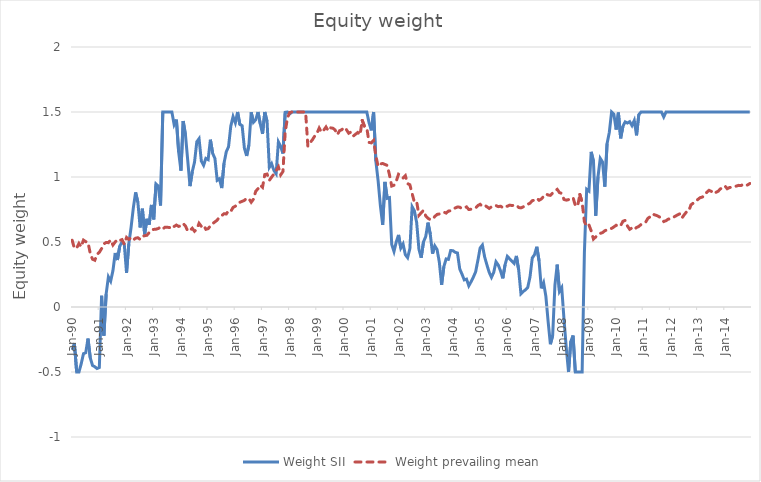
| Category | Weight SII | Weight prevailing mean |
|---|---|---|
| 1990-01-01 | -0.33 | 0.514 |
| 1990-02-01 | -0.278 | 0.451 |
| 1990-03-01 | -0.5 | 0.454 |
| 1990-04-01 | -0.5 | 0.489 |
| 1990-05-01 | -0.437 | 0.463 |
| 1990-06-01 | -0.359 | 0.515 |
| 1990-07-01 | -0.352 | 0.503 |
| 1990-08-01 | -0.243 | 0.498 |
| 1990-09-01 | -0.392 | 0.411 |
| 1990-10-01 | -0.45 | 0.368 |
| 1990-11-01 | -0.459 | 0.36 |
| 1990-12-01 | -0.473 | 0.405 |
| 1991-01-01 | -0.466 | 0.421 |
| 1991-02-01 | 0.087 | 0.449 |
| 1991-03-01 | -0.221 | 0.485 |
| 1991-04-01 | 0.099 | 0.496 |
| 1991-05-01 | 0.232 | 0.495 |
| 1991-06-01 | 0.199 | 0.516 |
| 1991-07-01 | 0.28 | 0.477 |
| 1991-08-01 | 0.415 | 0.5 |
| 1991-09-01 | 0.362 | 0.521 |
| 1991-10-01 | 0.468 | 0.512 |
| 1991-11-01 | 0.5 | 0.518 |
| 1991-12-01 | 0.484 | 0.483 |
| 1992-01-01 | 0.262 | 0.535 |
| 1992-02-01 | 0.486 | 0.52 |
| 1992-03-01 | 0.612 | 0.533 |
| 1992-04-01 | 0.762 | 0.515 |
| 1992-05-01 | 0.882 | 0.529 |
| 1992-06-01 | 0.807 | 0.533 |
| 1992-07-01 | 0.612 | 0.52 |
| 1992-08-01 | 0.756 | 0.543 |
| 1992-09-01 | 0.559 | 0.548 |
| 1992-10-01 | 0.678 | 0.552 |
| 1992-11-01 | 0.633 | 0.573 |
| 1992-12-01 | 0.785 | 0.592 |
| 1993-01-01 | 0.674 | 0.597 |
| 1993-02-01 | 0.946 | 0.599 |
| 1993-03-01 | 0.93 | 0.604 |
| 1993-04-01 | 0.781 | 0.614 |
| 1993-05-01 | 1.5 | 0.601 |
| 1993-06-01 | 1.5 | 0.614 |
| 1993-07-01 | 1.5 | 0.614 |
| 1993-08-01 | 1.5 | 0.611 |
| 1993-09-01 | 1.5 | 0.63 |
| 1993-10-01 | 1.404 | 0.62 |
| 1993-11-01 | 1.442 | 0.63 |
| 1993-12-01 | 1.192 | 0.62 |
| 1994-01-01 | 1.049 | 0.625 |
| 1994-02-01 | 1.43 | 0.642 |
| 1994-03-01 | 1.324 | 0.623 |
| 1994-04-01 | 1.128 | 0.584 |
| 1994-05-01 | 0.93 | 0.588 |
| 1994-06-01 | 1.041 | 0.606 |
| 1994-07-01 | 1.115 | 0.582 |
| 1994-08-01 | 1.271 | 0.6 |
| 1994-09-01 | 1.295 | 0.644 |
| 1994-10-01 | 1.123 | 0.621 |
| 1994-11-01 | 1.09 | 0.631 |
| 1994-12-01 | 1.143 | 0.598 |
| 1995-01-01 | 1.134 | 0.603 |
| 1995-02-01 | 1.287 | 0.624 |
| 1995-03-01 | 1.182 | 0.642 |
| 1995-04-01 | 1.142 | 0.655 |
| 1995-05-01 | 0.975 | 0.668 |
| 1995-06-01 | 0.987 | 0.693 |
| 1995-07-01 | 0.915 | 0.702 |
| 1995-08-01 | 1.104 | 0.718 |
| 1995-09-01 | 1.194 | 0.715 |
| 1995-10-01 | 1.232 | 0.741 |
| 1995-11-01 | 1.392 | 0.736 |
| 1995-12-01 | 1.465 | 0.766 |
| 1996-01-01 | 1.417 | 0.775 |
| 1996-02-01 | 1.5 | 0.791 |
| 1996-03-01 | 1.404 | 0.806 |
| 1996-04-01 | 1.395 | 0.813 |
| 1996-05-01 | 1.221 | 0.82 |
| 1996-06-01 | 1.162 | 0.837 |
| 1996-07-01 | 1.247 | 0.834 |
| 1996-08-01 | 1.498 | 0.806 |
| 1996-09-01 | 1.421 | 0.829 |
| 1996-10-01 | 1.44 | 0.89 |
| 1996-11-01 | 1.5 | 0.91 |
| 1996-12-01 | 1.41 | 0.938 |
| 1997-01-01 | 1.332 | 0.921 |
| 1997-02-01 | 1.5 | 1.019 |
| 1997-03-01 | 1.426 | 1.023 |
| 1997-04-01 | 1.075 | 0.973 |
| 1997-05-01 | 1.103 | 0.999 |
| 1997-06-01 | 1.051 | 1.022 |
| 1997-07-01 | 1.025 | 1.048 |
| 1997-08-01 | 1.27 | 1.078 |
| 1997-09-01 | 1.235 | 1.016 |
| 1997-10-01 | 1.181 | 1.042 |
| 1997-11-01 | 1.497 | 1.346 |
| 1997-12-01 | 1.5 | 1.455 |
| 1998-01-01 | 1.485 | 1.497 |
| 1998-02-01 | 1.5 | 1.5 |
| 1998-03-01 | 1.5 | 1.5 |
| 1998-04-01 | 1.5 | 1.5 |
| 1998-05-01 | 1.5 | 1.5 |
| 1998-06-01 | 1.5 | 1.5 |
| 1998-07-01 | 1.5 | 1.5 |
| 1998-08-01 | 1.5 | 1.5 |
| 1998-09-01 | 1.5 | 1.237 |
| 1998-10-01 | 1.5 | 1.265 |
| 1998-11-01 | 1.5 | 1.286 |
| 1998-12-01 | 1.5 | 1.315 |
| 1999-01-01 | 1.5 | 1.336 |
| 1999-02-01 | 1.5 | 1.376 |
| 1999-03-01 | 1.5 | 1.344 |
| 1999-04-01 | 1.5 | 1.36 |
| 1999-05-01 | 1.5 | 1.385 |
| 1999-06-01 | 1.5 | 1.355 |
| 1999-07-01 | 1.5 | 1.378 |
| 1999-08-01 | 1.5 | 1.376 |
| 1999-09-01 | 1.5 | 1.362 |
| 1999-10-01 | 1.5 | 1.325 |
| 1999-11-01 | 1.5 | 1.356 |
| 1999-12-01 | 1.5 | 1.364 |
| 2000-01-01 | 1.5 | 1.382 |
| 2000-02-01 | 1.5 | 1.364 |
| 2000-03-01 | 1.5 | 1.337 |
| 2000-04-01 | 1.5 | 1.346 |
| 2000-05-01 | 1.5 | 1.314 |
| 2000-06-01 | 1.5 | 1.328 |
| 2000-07-01 | 1.5 | 1.342 |
| 2000-08-01 | 1.5 | 1.324 |
| 2000-09-01 | 1.5 | 1.435 |
| 2000-10-01 | 1.5 | 1.388 |
| 2000-11-01 | 1.5 | 1.378 |
| 2000-12-01 | 1.417 | 1.266 |
| 2001-01-01 | 1.359 | 1.263 |
| 2001-02-01 | 1.5 | 1.281 |
| 2001-03-01 | 1.122 | 1.162 |
| 2001-04-01 | 0.97 | 1.082 |
| 2001-05-01 | 0.779 | 1.1 |
| 2001-06-01 | 0.632 | 1.104 |
| 2001-07-01 | 0.962 | 1.096 |
| 2001-08-01 | 0.836 | 1.09 |
| 2001-09-01 | 0.84 | 1.017 |
| 2001-10-01 | 0.481 | 0.93 |
| 2001-11-01 | 0.428 | 0.937 |
| 2001-12-01 | 0.5 | 0.968 |
| 2002-01-01 | 0.555 | 1.021 |
| 2002-02-01 | 0.453 | 1.011 |
| 2002-03-01 | 0.485 | 0.992 |
| 2002-04-01 | 0.402 | 1.01 |
| 2002-05-01 | 0.379 | 0.949 |
| 2002-06-01 | 0.449 | 0.94 |
| 2002-07-01 | 0.771 | 0.872 |
| 2002-08-01 | 0.74 | 0.806 |
| 2002-09-01 | 0.649 | 0.81 |
| 2002-10-01 | 0.444 | 0.705 |
| 2002-11-01 | 0.379 | 0.724 |
| 2002-12-01 | 0.501 | 0.743 |
| 2003-01-01 | 0.542 | 0.7 |
| 2003-02-01 | 0.649 | 0.682 |
| 2003-03-01 | 0.56 | 0.672 |
| 2003-04-01 | 0.41 | 0.675 |
| 2003-05-01 | 0.47 | 0.696 |
| 2003-06-01 | 0.442 | 0.712 |
| 2003-07-01 | 0.345 | 0.716 |
| 2003-08-01 | 0.171 | 0.721 |
| 2003-09-01 | 0.311 | 0.73 |
| 2003-10-01 | 0.37 | 0.722 |
| 2003-11-01 | 0.366 | 0.738 |
| 2003-12-01 | 0.434 | 0.74 |
| 2004-01-01 | 0.433 | 0.754 |
| 2004-02-01 | 0.421 | 0.762 |
| 2004-03-01 | 0.415 | 0.769 |
| 2004-04-01 | 0.293 | 0.768 |
| 2004-05-01 | 0.252 | 0.757 |
| 2004-06-01 | 0.208 | 0.761 |
| 2004-07-01 | 0.214 | 0.77 |
| 2004-08-01 | 0.163 | 0.75 |
| 2004-09-01 | 0.194 | 0.752 |
| 2004-10-01 | 0.23 | 0.758 |
| 2004-11-01 | 0.27 | 0.762 |
| 2004-12-01 | 0.358 | 0.78 |
| 2005-01-01 | 0.454 | 0.79 |
| 2005-02-01 | 0.477 | 0.774 |
| 2005-03-01 | 0.385 | 0.782 |
| 2005-04-01 | 0.323 | 0.771 |
| 2005-05-01 | 0.267 | 0.759 |
| 2005-06-01 | 0.228 | 0.77 |
| 2005-07-01 | 0.267 | 0.768 |
| 2005-08-01 | 0.348 | 0.78 |
| 2005-09-01 | 0.323 | 0.772 |
| 2005-10-01 | 0.278 | 0.775 |
| 2005-11-01 | 0.22 | 0.765 |
| 2005-12-01 | 0.324 | 0.778 |
| 2006-01-01 | 0.389 | 0.775 |
| 2006-02-01 | 0.371 | 0.783 |
| 2006-03-01 | 0.352 | 0.781 |
| 2006-04-01 | 0.335 | 0.783 |
| 2006-05-01 | 0.393 | 0.784 |
| 2006-06-01 | 0.285 | 0.765 |
| 2006-07-01 | 0.102 | 0.762 |
| 2006-08-01 | 0.12 | 0.77 |
| 2006-09-01 | 0.132 | 0.776 |
| 2006-10-01 | 0.15 | 0.79 |
| 2006-11-01 | 0.231 | 0.799 |
| 2006-12-01 | 0.377 | 0.818 |
| 2007-01-01 | 0.403 | 0.823 |
| 2007-02-01 | 0.463 | 0.836 |
| 2007-03-01 | 0.354 | 0.821 |
| 2007-04-01 | 0.144 | 0.831 |
| 2007-05-01 | 0.186 | 0.851 |
| 2007-06-01 | 0.083 | 0.87 |
| 2007-07-01 | -0.112 | 0.861 |
| 2007-08-01 | -0.286 | 0.859 |
| 2007-09-01 | -0.219 | 0.877 |
| 2007-10-01 | 0.169 | 0.895 |
| 2007-11-01 | 0.326 | 0.905 |
| 2007-12-01 | 0.119 | 0.88 |
| 2008-01-01 | 0.149 | 0.874 |
| 2008-02-01 | -0.095 | 0.827 |
| 2008-03-01 | -0.313 | 0.822 |
| 2008-04-01 | -0.5 | 0.826 |
| 2008-05-01 | -0.265 | 0.836 |
| 2008-06-01 | -0.219 | 0.841 |
| 2008-07-01 | -0.5 | 0.781 |
| 2008-08-01 | -0.5 | 0.776 |
| 2008-09-01 | -0.5 | 0.866 |
| 2008-10-01 | -0.5 | 0.805 |
| 2008-11-01 | 0.421 | 0.656 |
| 2008-12-01 | 0.906 | 0.62 |
| 2009-01-01 | 0.892 | 0.632 |
| 2009-02-01 | 1.193 | 0.585 |
| 2009-03-01 | 1.121 | 0.522 |
| 2009-04-01 | 0.702 | 0.539 |
| 2009-05-01 | 1.002 | 0.554 |
| 2009-06-01 | 1.144 | 0.566 |
| 2009-07-01 | 1.115 | 0.572 |
| 2009-08-01 | 0.925 | 0.586 |
| 2009-09-01 | 1.257 | 0.594 |
| 2009-10-01 | 1.344 | 0.604 |
| 2009-11-01 | 1.5 | 0.605 |
| 2009-12-01 | 1.484 | 0.616 |
| 2010-01-01 | 1.365 | 0.629 |
| 2010-02-01 | 1.495 | 0.619 |
| 2010-03-01 | 1.297 | 0.626 |
| 2010-04-01 | 1.39 | 0.659 |
| 2010-05-01 | 1.424 | 0.666 |
| 2010-06-01 | 1.415 | 0.622 |
| 2010-07-01 | 1.426 | 0.597 |
| 2010-08-01 | 1.395 | 0.608 |
| 2010-09-01 | 1.435 | 0.595 |
| 2010-10-01 | 1.321 | 0.612 |
| 2010-11-01 | 1.48 | 0.62 |
| 2010-12-01 | 1.5 | 0.635 |
| 2011-01-01 | 1.5 | 0.645 |
| 2011-02-01 | 1.5 | 0.651 |
| 2011-03-01 | 1.5 | 0.682 |
| 2011-04-01 | 1.5 | 0.694 |
| 2011-05-01 | 1.5 | 0.715 |
| 2011-06-01 | 1.5 | 0.709 |
| 2011-07-01 | 1.5 | 0.703 |
| 2011-08-01 | 1.5 | 0.694 |
| 2011-09-01 | 1.5 | 0.678 |
| 2011-10-01 | 1.462 | 0.657 |
| 2011-11-01 | 1.5 | 0.664 |
| 2011-12-01 | 1.5 | 0.676 |
| 2012-01-01 | 1.5 | 0.678 |
| 2012-02-01 | 1.5 | 0.688 |
| 2012-03-01 | 1.5 | 0.698 |
| 2012-04-01 | 1.5 | 0.708 |
| 2012-05-01 | 1.5 | 0.716 |
| 2012-06-01 | 1.5 | 0.684 |
| 2012-07-01 | 1.5 | 0.709 |
| 2012-08-01 | 1.5 | 0.731 |
| 2012-09-01 | 1.5 | 0.736 |
| 2012-10-01 | 1.5 | 0.786 |
| 2012-11-01 | 1.5 | 0.799 |
| 2012-12-01 | 1.5 | 0.809 |
| 2013-01-01 | 1.5 | 0.826 |
| 2013-02-01 | 1.5 | 0.841 |
| 2013-03-01 | 1.5 | 0.846 |
| 2013-04-01 | 1.5 | 0.854 |
| 2013-05-01 | 1.5 | 0.883 |
| 2013-06-01 | 1.5 | 0.898 |
| 2013-07-01 | 1.5 | 0.889 |
| 2013-08-01 | 1.5 | 0.899 |
| 2013-09-01 | 1.5 | 0.881 |
| 2013-10-01 | 1.5 | 0.89 |
| 2013-11-01 | 1.5 | 0.909 |
| 2013-12-01 | 1.5 | 0.916 |
| 2014-01-01 | 1.5 | 0.931 |
| 2014-02-01 | 1.5 | 0.91 |
| 2014-03-01 | 1.5 | 0.919 |
| 2014-04-01 | 1.5 | 0.922 |
| 2014-05-01 | 1.5 | 0.924 |
| 2014-06-01 | 1.5 | 0.93 |
| 2014-07-01 | 1.5 | 0.936 |
| 2014-08-01 | 1.5 | 0.934 |
| 2014-09-01 | 1.5 | 0.942 |
| 2014-10-01 | 1.5 | 0.933 |
| 2014-11-01 | 1.5 | 0.939 |
| 2014-12-01 | 1.5 | 0.95 |